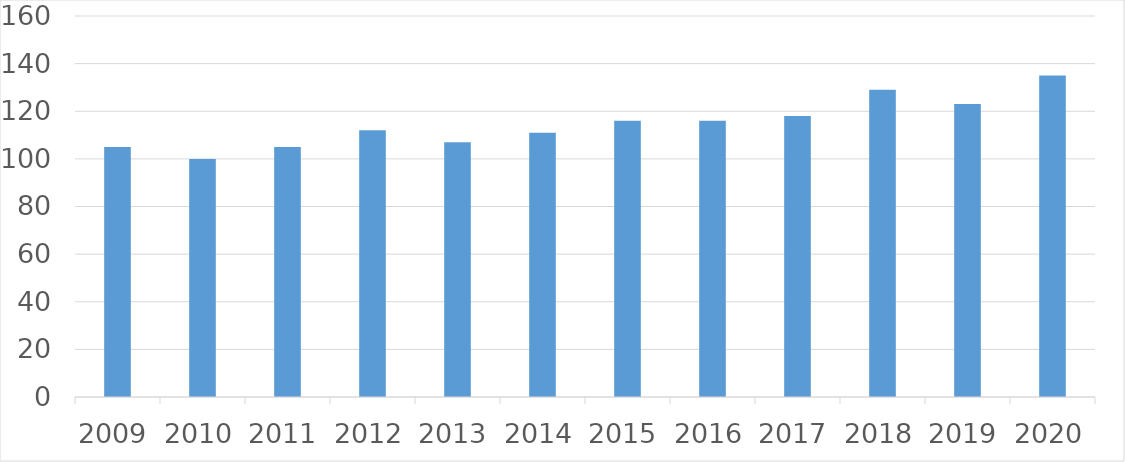
| Category | Series 0 |
|---|---|
| 2009 | 105 |
| 2010 | 100 |
| 2011 | 105 |
| 2012 | 112 |
| 2013 | 107 |
| 2014 | 111 |
| 2015 | 116 |
| 2016 | 116 |
| 2017 | 118 |
| 2018 | 129 |
| 2019 | 123 |
| 2020 | 135 |